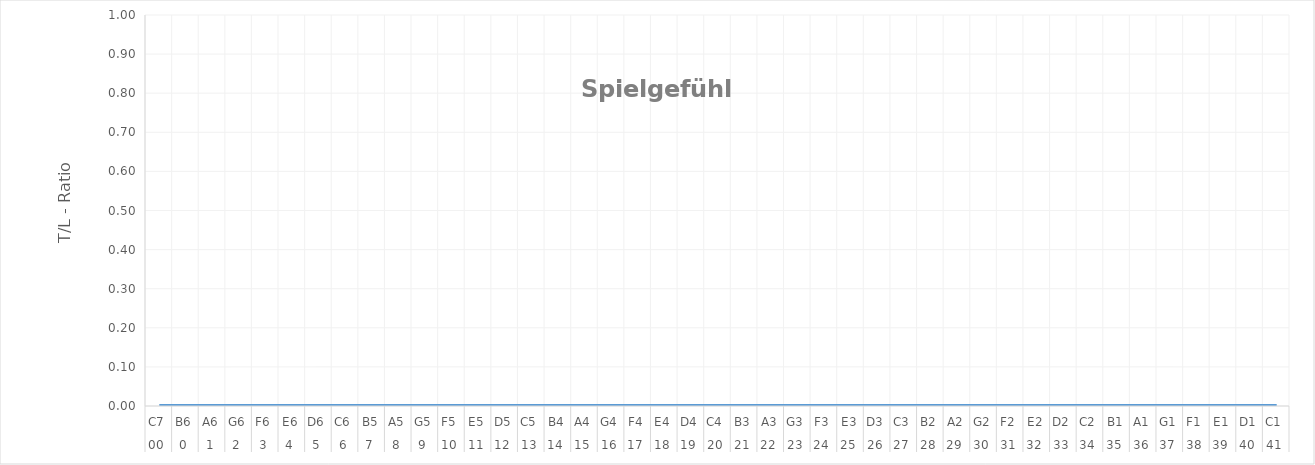
| Category | Spielgefühl T/L-Ratio |
|---|---|
| 0 | 0 |
| 1 | 0 |
| 2 | 0 |
| 3 | 0 |
| 4 | 0 |
| 5 | 0 |
| 6 | 0 |
| 7 | 0 |
| 8 | 0 |
| 9 | 0 |
| 10 | 0 |
| 11 | 0 |
| 12 | 0 |
| 13 | 0 |
| 14 | 0 |
| 15 | 0 |
| 16 | 0 |
| 17 | 0 |
| 18 | 0 |
| 19 | 0 |
| 20 | 0 |
| 21 | 0 |
| 22 | 0 |
| 23 | 0 |
| 24 | 0 |
| 25 | 0 |
| 26 | 0 |
| 27 | 0 |
| 28 | 0 |
| 29 | 0 |
| 30 | 0 |
| 31 | 0 |
| 32 | 0 |
| 33 | 0 |
| 34 | 0 |
| 35 | 0 |
| 36 | 0 |
| 37 | 0 |
| 38 | 0 |
| 39 | 0 |
| 40 | 0 |
| 41 | 0 |
| 42 | 0 |